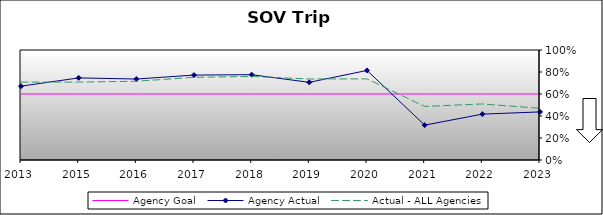
| Category | Agency Goal | Agency Actual | Actual - ALL Agencies |
|---|---|---|---|
| 2013.0 | 0.6 | 0.671 | 0.708 |
| 2015.0 | 0.6 | 0.746 | 0.708 |
| 2016.0 | 0.6 | 0.736 | 0.716 |
| 2017.0 | 0.6 | 0.772 | 0.752 |
| 2018.0 | 0.6 | 0.776 | 0.759 |
| 2019.0 | 0.6 | 0.706 | 0.736 |
| 2020.0 | 0.6 | 0.814 | 0.737 |
| 2021.0 | 0.6 | 0.317 | 0.487 |
| 2022.0 | 0.6 | 0.417 | 0.509 |
| 2023.0 | 0.6 | 0.437 | 0.47 |